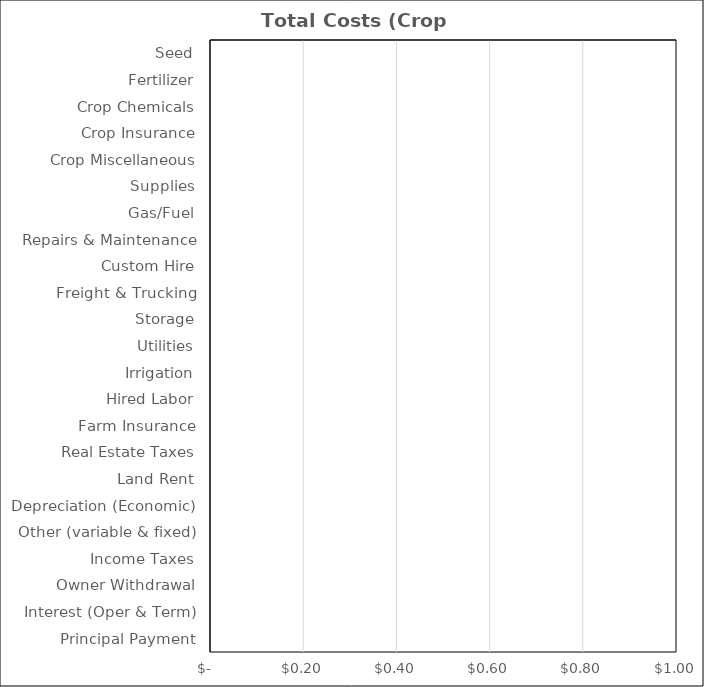
| Category | Wheat |
|---|---|
| Seed | 0 |
| Fertilizer | 0 |
| Crop Chemicals | 0 |
| Crop Insurance | 0 |
| Crop Miscellaneous | 0 |
| Supplies | 0 |
| Gas/Fuel | 0 |
| Repairs & Maintenance | 0 |
| Custom Hire | 0 |
| Freight & Trucking | 0 |
| Storage | 0 |
| Utilities | 0 |
| Irrigation | 0 |
| Hired Labor | 0 |
| Farm Insurance | 0 |
| Real Estate Taxes | 0 |
| Land Rent | 0 |
| Depreciation (Economic) | 0 |
| Other (variable & fixed) | 0 |
| Income Taxes | 0 |
| Owner Withdrawal | 0 |
| Interest (Oper & Term) | 0 |
| Principal Payment | 0 |